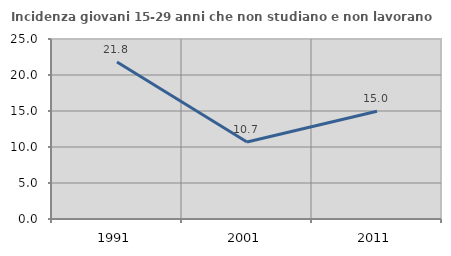
| Category | Incidenza giovani 15-29 anni che non studiano e non lavorano  |
|---|---|
| 1991.0 | 21.818 |
| 2001.0 | 10.695 |
| 2011.0 | 14.966 |